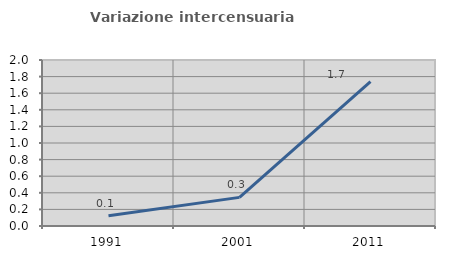
| Category | Variazione intercensuaria annua |
|---|---|
| 1991.0 | 0.123 |
| 2001.0 | 0.345 |
| 2011.0 | 1.739 |